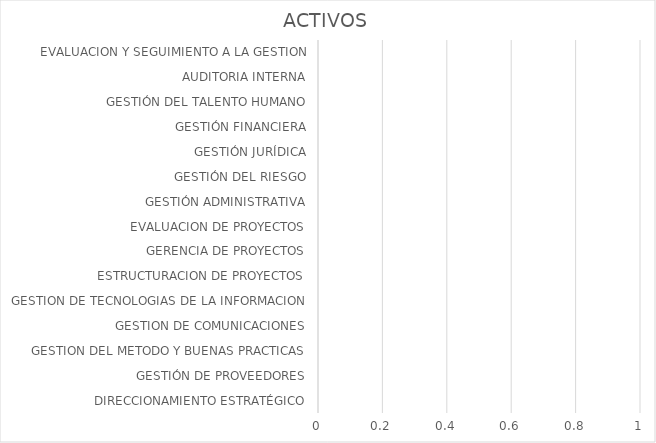
| Category | ACTIVOS |
|---|---|
| DIRECCIONAMIENTO ESTRATÉGICO | 0 |
| GESTIÓN DE PROVEEDORES | 0 |
| GESTION DEL METODO Y BUENAS PRACTICAS | 0 |
| GESTION DE COMUNICACIONES | 0 |
| GESTION DE TECNOLOGIAS DE LA INFORMACION | 0 |
| ESTRUCTURACION DE PROYECTOS | 0 |
| GERENCIA DE PROYECTOS | 0 |
| EVALUACION DE PROYECTOS | 0 |
| GESTIÓN ADMINISTRATIVA | 0 |
| GESTIÓN DEL RIESGO | 0 |
| GESTIÓN JURÍDICA | 0 |
| GESTIÓN FINANCIERA | 0 |
| GESTIÓN DEL TALENTO HUMANO | 0 |
| AUDITORIA INTERNA | 0 |
| EVALUACION Y SEGUIMIENTO A LA GESTION | 0 |